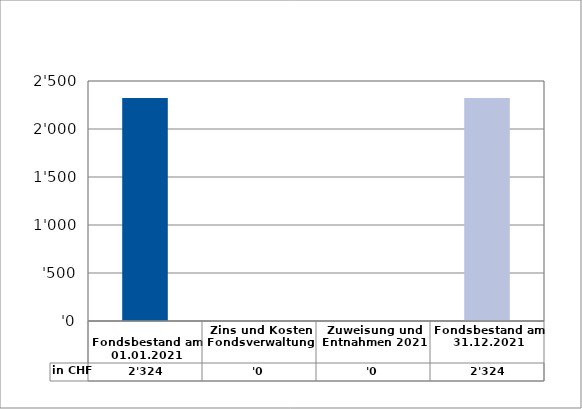
| Category | in CHF |
|---|---|
| 
Fondsbestand am 01.01.2021

 | 2324 |
| Zins und Kosten Fondsverwaltung | 0 |
| Zuweisung und Entnahmen 2021 | 0 |
| Fondsbestand am 31.12.2021 | 2324 |